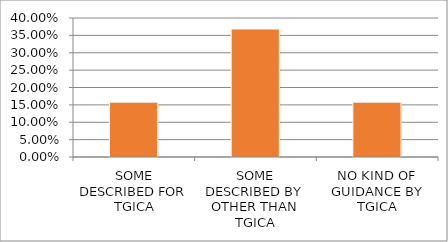
| Category | Series 0 |
|---|---|
| SOME DESCRIBED FOR TGICA | 0.158 |
| SOME DESCRIBED BY OTHER THAN TGICA | 0.368 |
| NO KIND OF GUIDANCE BY TGICA | 0.158 |